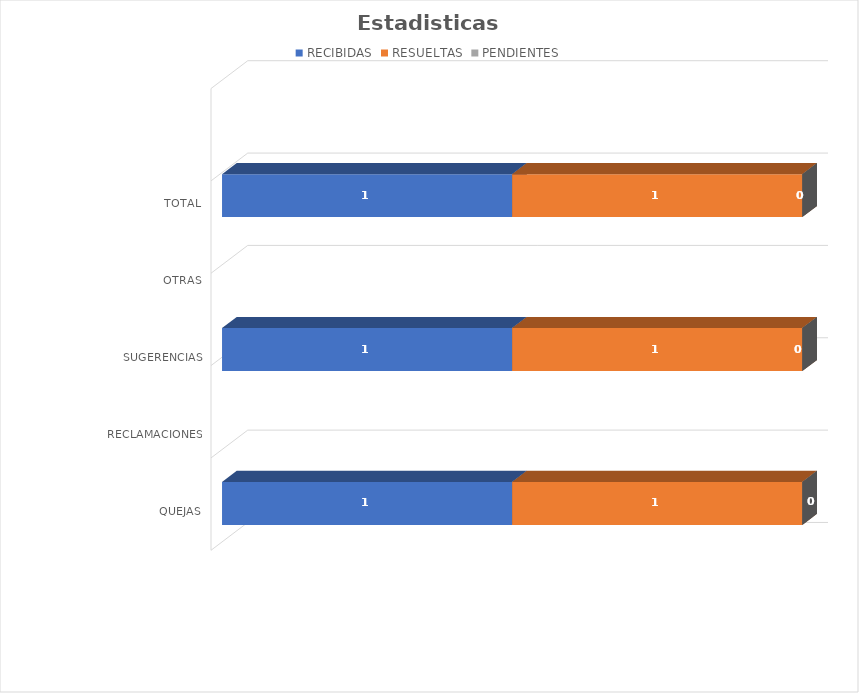
| Category | RECIBIDAS | RESUELTAS | PENDIENTES |
|---|---|---|---|
| QUEJAS | 1 | 1 | 0 |
| RECLAMACIONES | 0 | 0 | 0 |
| SUGERENCIAS | 1 | 1 | 0 |
| OTRAS | 0 | 0 | 0 |
| TOTAL | 1 | 1 | 0 |